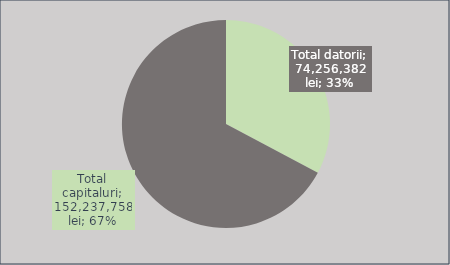
| Category | Series 0 |
|---|---|
| Total datorii | 74256382 |
| Total capitaluri | 152237758 |